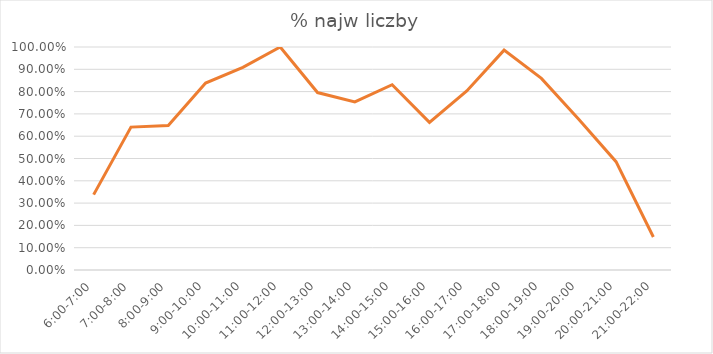
| Category | % najw liczby |
|---|---|
| 6:00-7:00 | 0.338 |
| 7:00-8:00 | 0.641 |
| 8:00-9:00 | 0.648 |
| 9:00-10:00 | 0.838 |
| 10:00-11:00 | 0.908 |
| 11:00-12:00 | 1 |
| 12:00-13:00 | 0.796 |
| 13:00-14:00 | 0.754 |
| 14:00-15:00 | 0.831 |
| 15:00-16:00 | 0.662 |
| 16:00-17:00 | 0.803 |
| 17:00-18:00 | 0.986 |
| 18:00-19:00 | 0.859 |
| 19:00-20:00 | 0.676 |
| 20:00-21:00 | 0.486 |
| 21:00-22:00 | 0.148 |